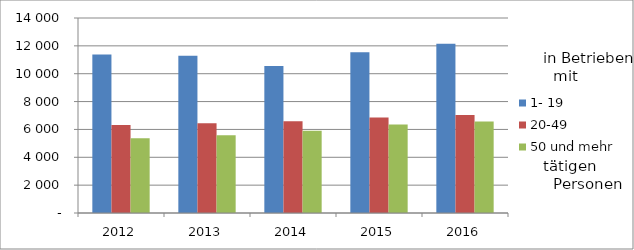
| Category | 1- 19 | 20-49 | 50 und mehr |
|---|---|---|---|
| 2012.0 | 11384 | 6312 | 5358 |
| 2013.0 | 11284 | 6435 | 5582 |
| 2014.0 | 10551 | 6588 | 5913 |
| 2015.0 | 11550 | 6857 | 6353 |
| 2016.0 | 12159 | 7039 | 6566 |